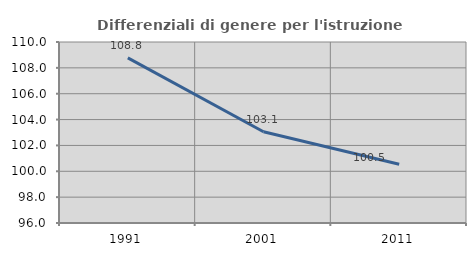
| Category | Differenziali di genere per l'istruzione superiore |
|---|---|
| 1991.0 | 108.777 |
| 2001.0 | 103.057 |
| 2011.0 | 100.541 |